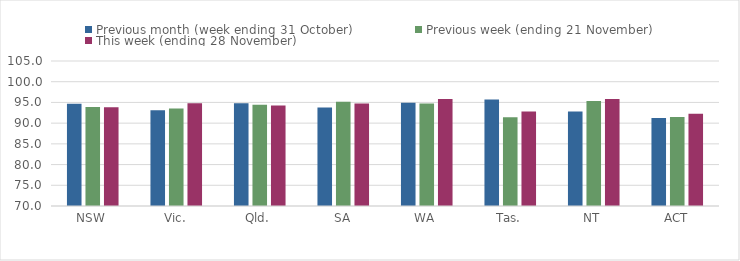
| Category | Previous month (week ending 31 October) | Previous week (ending 21 November) | This week (ending 28 November) |
|---|---|---|---|
| NSW | 94.68 | 93.91 | 93.81 |
| Vic. | 93.11 | 93.54 | 94.78 |
| Qld. | 94.83 | 94.41 | 94.28 |
| SA | 93.77 | 95.18 | 94.73 |
| WA | 94.92 | 94.72 | 95.83 |
| Tas. | 95.73 | 91.4 | 92.83 |
| NT | 92.81 | 95.34 | 95.83 |
| ACT | 91.25 | 91.47 | 92.29 |